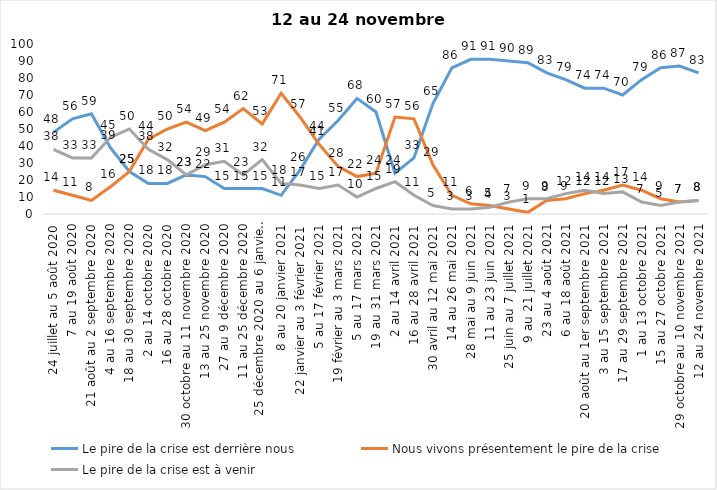
| Category | Le pire de la crise est derrière nous | Nous vivons présentement le pire de la crise | Le pire de la crise est à venir |
|---|---|---|---|
| 24 juillet au 5 août 2020 | 48 | 14 | 38 |
| 7 au 19 août 2020 | 56 | 11 | 33 |
| 21 août au 2 septembre 2020 | 59 | 8 | 33 |
| 4 au 16 septembre 2020 | 39 | 16 | 45 |
| 18 au 30 septembre 2020 | 25 | 25 | 50 |
| 2 au 14 octobre 2020 | 18 | 44 | 38 |
| 16 au 28 octobre 2020 | 18 | 50 | 32 |
| 30 octobre au 11 novembre 2020 | 23 | 54 | 23 |
| 13 au 25 novembre 2020 | 22 | 49 | 29 |
| 27 au 9 décembre 2020 | 15 | 54 | 31 |
| 11 au 25 décembre 2020 | 15 | 62 | 23 |
| 25 décembre 2020 au 6 janvier 2021 | 15 | 53 | 32 |
| 8 au 20 janvier 2021 | 11 | 71 | 18 |
| 22 janvier au 3 février 2021 | 26 | 57 | 17 |
| 5 au 17 février 2021 | 44 | 41 | 15 |
| 19 février au 3 mars 2021 | 55 | 28 | 17 |
| 5 au 17 mars 2021 | 68 | 22 | 10 |
| 19 au 31 mars 2021 | 60 | 24 | 15 |
| 2 au 14 avril 2021 | 24 | 57 | 19 |
| 16 au 28 avril 2021 | 33 | 56 | 11 |
| 30 avril au 12 mai 2021 | 65 | 29 | 5 |
| 14 au 26 mai 2021 | 86 | 11 | 3 |
| 28 mai au 9 juin 2021 | 91 | 6 | 3 |
| 11 au 23 juin 2021 | 91 | 5 | 4 |
| 25 juin au 7 juillet 2021 | 90 | 3 | 7 |
| 9 au 21 juillet 2021 | 89 | 1 | 9 |
| 23 au 4 août 2021 | 83 | 8 | 9 |
| 6 au 18 août 2021 | 79 | 9 | 12 |
| 20 août au 1er septembre 2021 | 74 | 12 | 14 |
| 3 au 15 septembre 2021 | 74 | 14 | 12 |
| 17 au 29 septembre 2021 | 70 | 17 | 13 |
| 1 au 13 octobre 2021 | 79 | 14 | 7 |
| 15 au 27 octobre 2021 | 86 | 9 | 5 |
| 29 octobre au 10 novembre 2021 | 87 | 7 | 7 |
| 12 au 24 novembre 2021 | 83 | 8 | 8 |